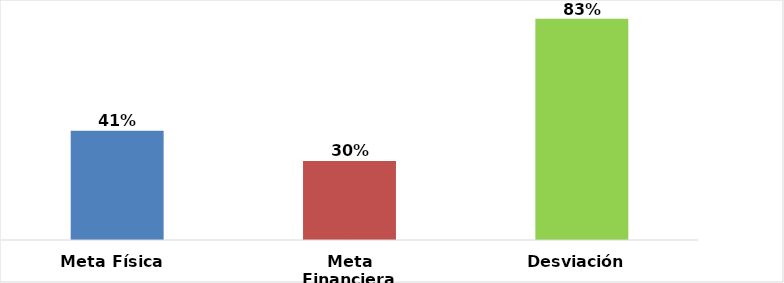
| Category | Meta Física  |
|---|---|
| Meta Física  | 0.41 |
| Meta Financiera | 0.296 |
| Desviación  | 0.83 |